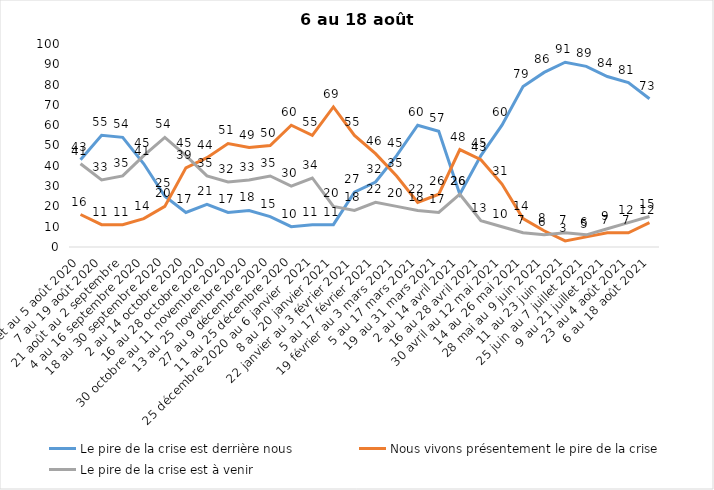
| Category | Le pire de la crise est derrière nous | Nous vivons présentement le pire de la crise | Le pire de la crise est à venir |
|---|---|---|---|
| 24 juillet au 5 août 2020 | 43 | 16 | 41 |
| 7 au 19 août 2020 | 55 | 11 | 33 |
| 21 août au 2 septembre | 54 | 11 | 35 |
| 4 au 16 septembre 2020 | 41 | 14 | 45 |
| 18 au 30 septembre 2020 | 25 | 20 | 54 |
| 2 au 14 octobre 2020 | 17 | 39 | 45 |
| 16 au 28 octobre 2020 | 21 | 44 | 35 |
| 30 octobre au 11 novembre 2020 | 17 | 51 | 32 |
| 13 au 25 novembre 2020 | 18 | 49 | 33 |
| 27 au 9 décembre 2020 | 15 | 50 | 35 |
| 11 au 25 décembre 2020 | 10 | 60 | 30 |
| 25 décembre 2020 au 6 janvier  2021 | 11 | 55 | 34 |
| 8 au 20 janvier 2021 | 11 | 69 | 20 |
| 22 janvier au 3 février 2021 | 27 | 55 | 18 |
| 5 au 17 février 2021 | 32 | 46 | 22 |
| 19 février au 3 mars 2021 | 45 | 35 | 20 |
| 5 au 17 mars 2021 | 60 | 22 | 18 |
| 19 au 31 mars 2021 | 57 | 26 | 17 |
| 2 au 14 avril 2021 | 26 | 48 | 26 |
| 16 au 28 avril 2021 | 45 | 43 | 13 |
| 30 avril au 12 mai 2021 | 60 | 31 | 10 |
| 14 au 26 mai 2021 | 79 | 14 | 7 |
| 28 mai au 9 juin 2021 | 86 | 8 | 6 |
| 11 au 23 juin 2021 | 91 | 3 | 7 |
| 25 juin au 7 juillet 2021 | 89 | 5 | 6 |
| 9 au 21 juillet 2021 | 84 | 7 | 9 |
| 23 au 4 août 2021 | 81 | 7 | 12 |
| 6 au 18 août 2021 | 73 | 12 | 15 |